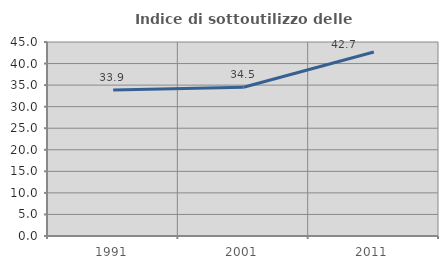
| Category | Indice di sottoutilizzo delle abitazioni  |
|---|---|
| 1991.0 | 33.861 |
| 2001.0 | 34.503 |
| 2011.0 | 42.69 |